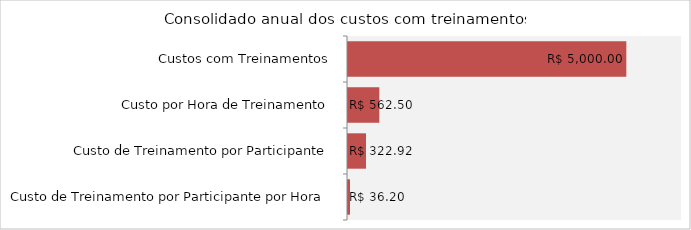
| Category | Total |
|---|---|
| Custos com Treinamentos | 5000 |
| Custo por Hora de Treinamento | 562.5 |
| Custo de Treinamento por Participante | 322.917 |
| Custo de Treinamento por Participante por Hora | 36.198 |